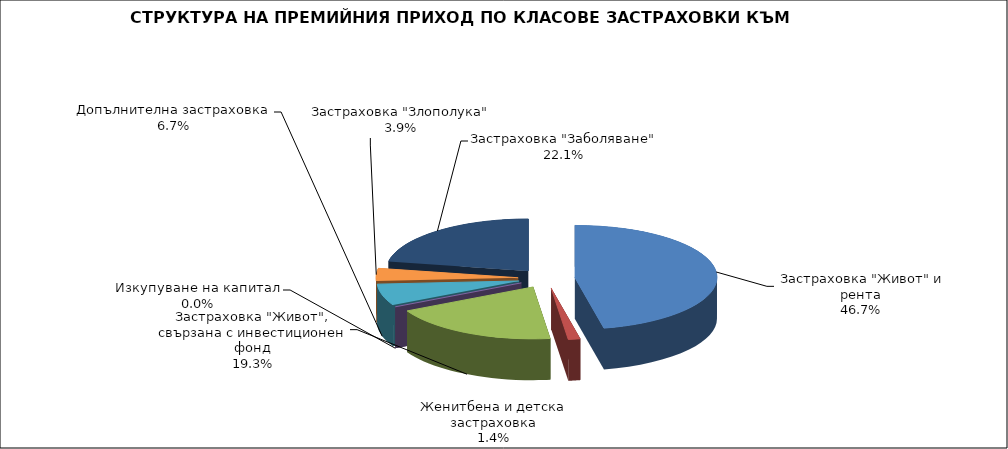
| Category |  Застраховка "Живот" и рента |
|---|---|
|  Застраховка "Живот" и рента | 66671354.545 |
| Женитбена и детска застраховка | 1952728.965 |
| Застраховка "Живот", свързана с инвестиционен фонд | 27515483.948 |
| Изкупуване на капитал | 0 |
| Допълнителна застраховка | 9510583.94 |
| Застраховка "Злополука" | 5550183.872 |
| Застраховка "Заболяване" | 31535717.91 |